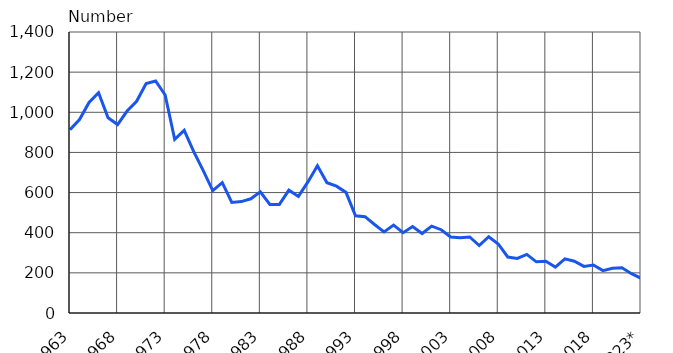
| Category | Persons killed in road traffic accidents |
|---|---|
| 1963 | 913 |
| 1964 | 964 |
| 1965 | 1049 |
| 1966 | 1098 |
| 1967 | 973 |
| 1968 | 939 |
| 1969 | 1006 |
| 1970 | 1055 |
| 1971 | 1143 |
| 1972 | 1156 |
| 1973 | 1086 |
| 1974 | 865 |
| 1975 | 910 |
| 1976 | 804 |
| 1977 | 709 |
| 1978 | 610 |
| 1979 | 650 |
| 1980 | 551 |
| 1981 | 555 |
| 1982 | 569 |
| 1983 | 604 |
| 1984 | 541 |
| 1985 | 541 |
| 1986 | 612 |
| 1987 | 581 |
| 1988 | 653 |
| 1989 | 734 |
| 1990 | 649 |
| 1991 | 632 |
| 1992 | 601 |
| 1993 | 484 |
| 1994 | 480 |
| 1995 | 441 |
| 1996 | 404 |
| 1997 | 438 |
| 1998 | 400 |
| 1999 | 431 |
| 2000 | 396 |
| 2001 | 433 |
| 2002 | 415 |
| 2003 | 379 |
| 2004 | 375 |
| 2005 | 379 |
| 2006 | 336 |
| 2007 | 380 |
| 2008 | 344 |
| 2009 | 279 |
| 2010 | 272 |
| 2011 | 292 |
| 2012 | 255 |
| 2013 | 258 |
| 2014 | 229 |
| 2015 | 270 |
| 2016 | 258 |
| 2017 | 232 |
| 2018 | 239 |
| 2019 | 211 |
| 2020 | 223 |
| 2021 | 225 |
| 2022 | 196 |
| 2023* | 173 |